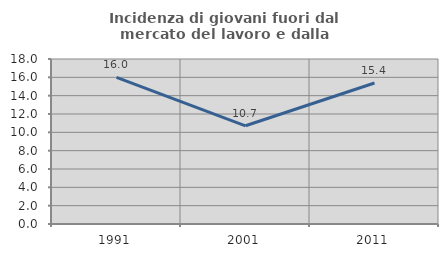
| Category | Incidenza di giovani fuori dal mercato del lavoro e dalla formazione  |
|---|---|
| 1991.0 | 16 |
| 2001.0 | 10.714 |
| 2011.0 | 15.385 |